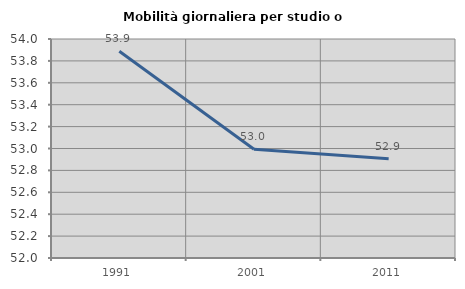
| Category | Mobilità giornaliera per studio o lavoro |
|---|---|
| 1991.0 | 53.889 |
| 2001.0 | 52.993 |
| 2011.0 | 52.906 |